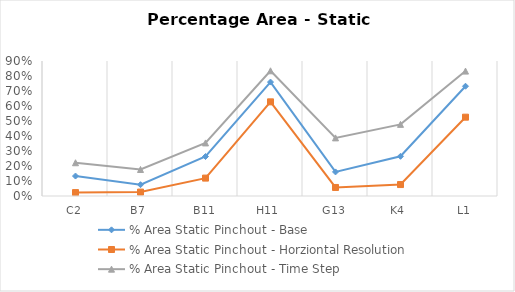
| Category | % Area Static Pinchout - Base | % Area Static Pinchout - Horziontal Resolution | % Area Static Pinchout - Time Step |
|---|---|---|---|
| C2 | 0.133 | 0.023 | 0.222 |
| B7 | 0.075 | 0.026 | 0.177 |
| B11 | 0.263 | 0.119 | 0.354 |
| H11 | 0.76 | 0.628 | 0.835 |
| G13 | 0.161 | 0.057 | 0.387 |
| K4 | 0.265 | 0.076 | 0.478 |
| L1 | 0.732 | 0.525 | 0.833 |